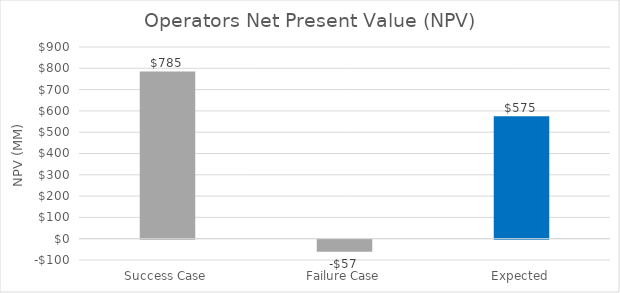
| Category | Net Present Value (NPV) |
|---|---|
| Success Case | 785.448 |
| Failure Case | -56.689 |
| Expected | 574.914 |